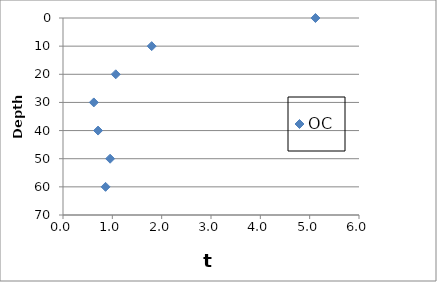
| Category | OC |
|---|---|
| 5.117478510028652 | 0 |
| 1.797431865828092 | 10 |
| 1.068798449612403 | 20 |
| 0.624809741248097 | 30 |
| 0.710737179487179 | 40 |
| 0.955128205128205 | 50 |
| 0.863001745200698 | 60 |